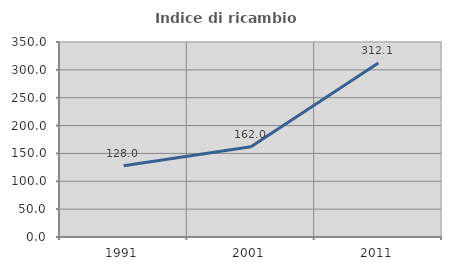
| Category | Indice di ricambio occupazionale  |
|---|---|
| 1991.0 | 127.999 |
| 2001.0 | 161.99 |
| 2011.0 | 312.131 |